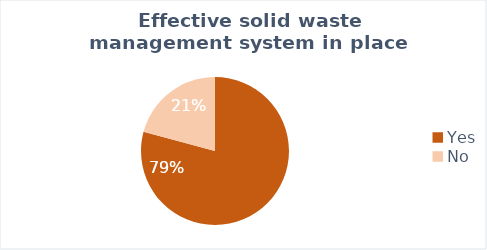
| Category | Rakhine |
|---|---|
| Yes | 19 |
| No | 5 |